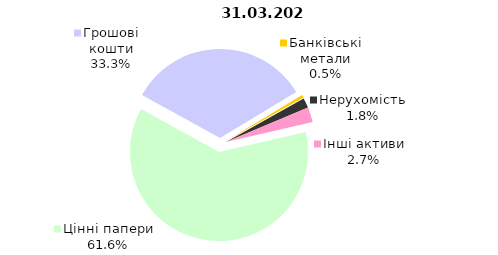
| Category | Всього |
|---|---|
| Цінні папери | 1236.78 |
| Грошові кошти | 669.349 |
| Банківські метали | 10.485 |
| Нерухомість | 35.602 |
| Інші активи | 55.073 |